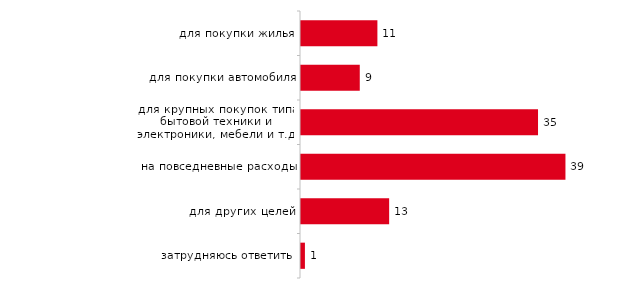
| Category | Series 0 |
|---|---|
| для покупки жилья | 11.272 |
| для покупки автомобиля | 8.671 |
| для крупных покупок типа бытовой техники и электроники, мебели и т.д. | 34.971 |
| на повседневные расходы | 39.017 |
| для других целей | 13.006 |
| затрудняюсь ответить | 0.578 |